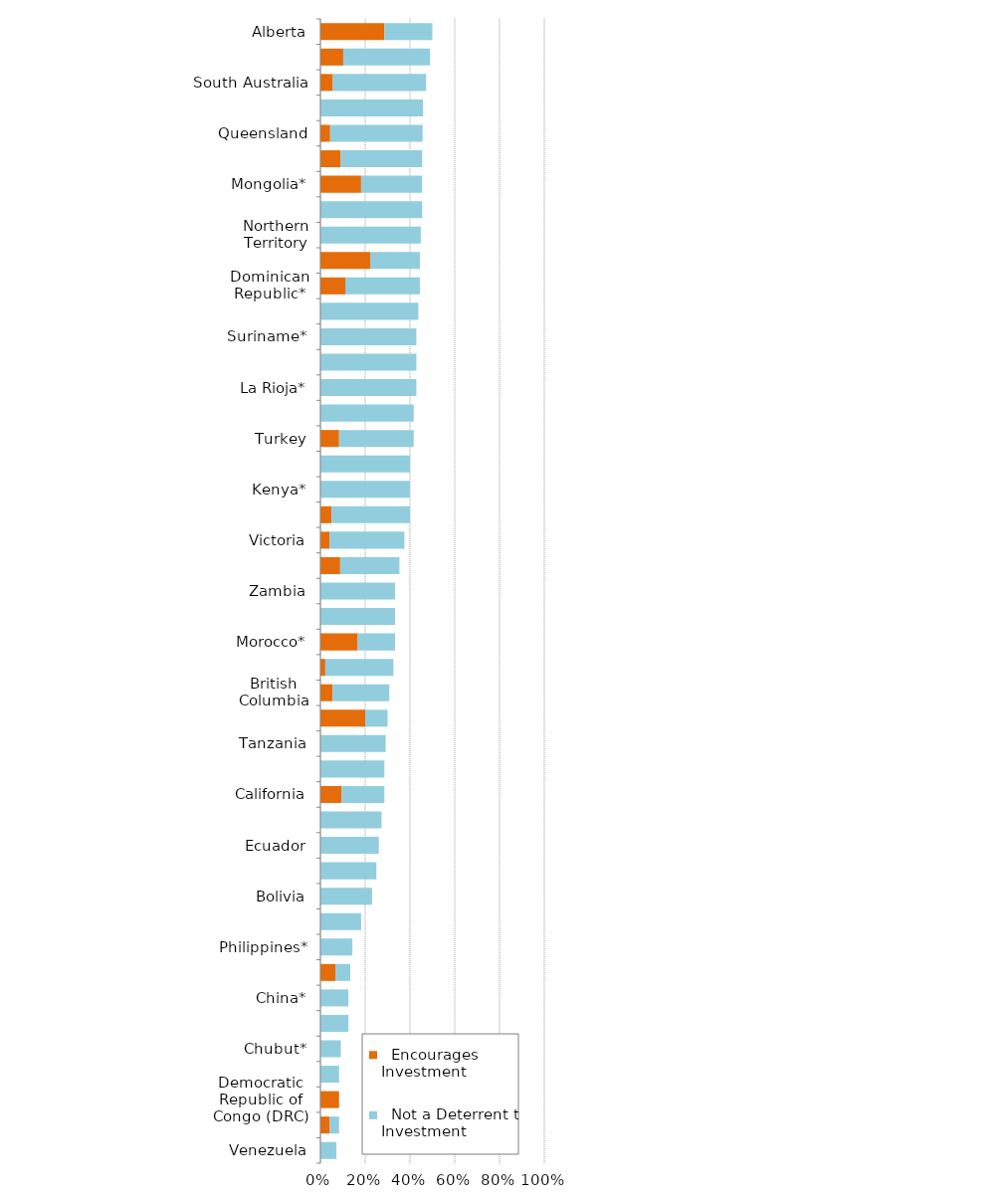
| Category |   Encourages Investment |   Not a Deterrent to Investment |
|---|---|---|
| Venezuela | 0 | 0.071 |
| Indonesia | 0.042 | 0.042 |
| Democratic Republic of Congo (DRC) | 0.083 | 0 |
| Zimbabwe | 0 | 0.083 |
| Chubut* | 0 | 0.091 |
| Panama* | 0 | 0.125 |
| China* | 0 | 0.125 |
| Papua New Guinea | 0.067 | 0.067 |
| Philippines* | 0 | 0.143 |
| Guatemala | 0 | 0.182 |
| Bolivia | 0 | 0.231 |
| South Africa | 0 | 0.25 |
| Ecuador | 0 | 0.261 |
| Colombia | 0 | 0.273 |
| California | 0.095 | 0.19 |
| Ethiopia* | 0 | 0.286 |
| Tanzania | 0 | 0.292 |
| Ivory Coast* | 0.2 | 0.1 |
| British Columbia | 0.055 | 0.253 |
| New South Wales | 0.022 | 0.304 |
| Morocco* | 0.167 | 0.167 |
| Mozambique* | 0 | 0.333 |
| Zambia | 0 | 0.333 |
| Northwest Territories | 0.088 | 0.265 |
| Victoria | 0.042 | 0.333 |
| New Zealand | 0.05 | 0.35 |
| Kenya* | 0 | 0.4 |
| Nicaragua* | 0 | 0.4 |
| Turkey | 0.083 | 0.333 |
| Ghana | 0 | 0.417 |
| La Rioja* | 0 | 0.429 |
| Guyana* | 0 | 0.429 |
| Suriname* | 0 | 0.429 |
| Santa Cruz | 0 | 0.438 |
| Dominican Republic* | 0.111 | 0.333 |
| Kazakhstan* | 0.222 | 0.222 |
| Northern Territory | 0 | 0.448 |
| Mendoza | 0 | 0.455 |
| Mongolia* | 0.182 | 0.273 |
| Russia* | 0.091 | 0.364 |
| Queensland | 0.043 | 0.413 |
| Brazil | 0 | 0.458 |
| South Australia | 0.056 | 0.417 |
| Peru | 0.102 | 0.388 |
| Alberta | 0.286 | 0.214 |